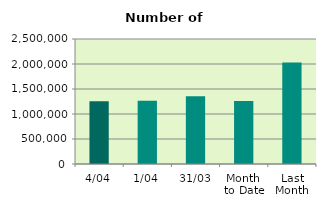
| Category | Series 0 |
|---|---|
| 4/04 | 1256296 |
| 1/04 | 1262726 |
| 31/03 | 1354352 |
| Month 
to Date | 1259511 |
| Last
Month | 2030137.913 |